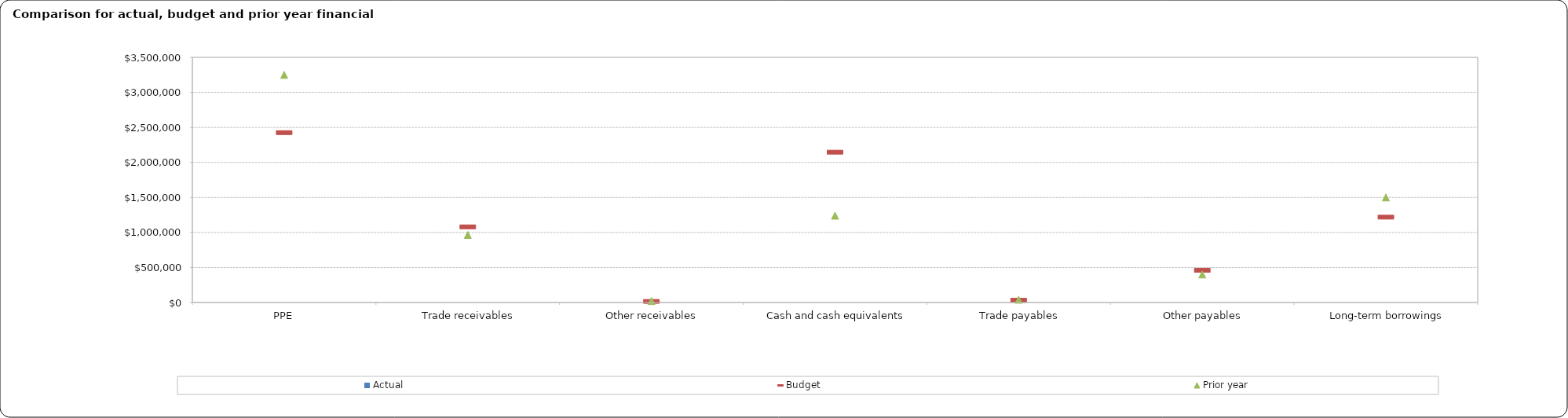
| Category | Actual |
|---|---|
| PPE | 0 |
| Trade receivables | 0 |
| Other receivables | 0 |
| Cash and cash equivalents | 0 |
| Trade payables | 0 |
| Other payables | 0 |
| Long-term borrowings | 0 |